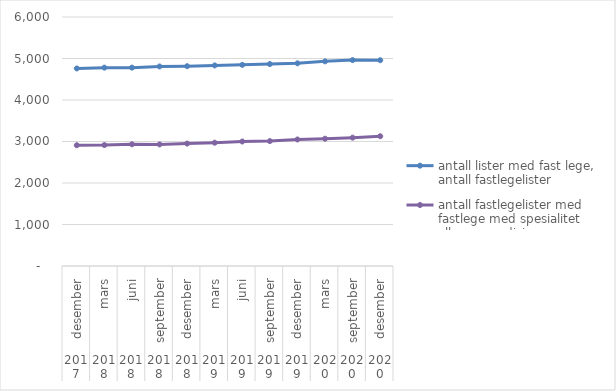
| Category | antall lister med fast lege, antall fastlegelister | antall fastlegelister med fastlege med spesialitet allmennmedisin |
|---|---|---|
| 0 | 4760 | 2910 |
| 1 | 4780 | 2914 |
| 2 | 4780 | 2933 |
| 3 | 4808 | 2930 |
| 4 | 4815 | 2950 |
| 5 | 4833 | 2971 |
| 6 | 4847 | 3000 |
| 7 | 4866 | 3010 |
| 8 | 4884 | 3049 |
| 9 | 4931 | 3067 |
| 10 | 4961 | 3093 |
| 11 | 4959 | 3127 |